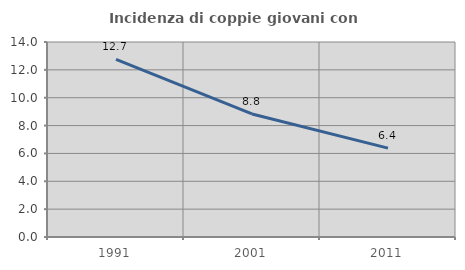
| Category | Incidenza di coppie giovani con figli |
|---|---|
| 1991.0 | 12.749 |
| 2001.0 | 8.835 |
| 2011.0 | 6.383 |